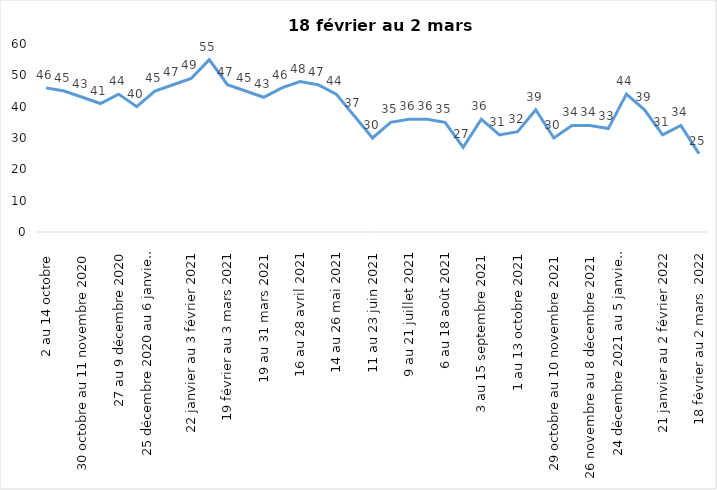
| Category | Toujours aux trois mesures |
|---|---|
| 2 au 14 octobre  | 46 |
| 16 au 28 octobre 2020 | 45 |
| 30 octobre au 11 novembre 2020 | 43 |
| 13 au 25 novembre 2020 | 41 |
| 27 au 9 décembre 2020 | 44 |
| 11 au 25 décembre 2020 | 40 |
| 25 décembre 2020 au 6 janvier 2021 | 45 |
| 8 au 20 janvier 2021 | 47 |
| 22 janvier au 3 février 2021 | 49 |
| 5 au 17 février 2021 | 55 |
| 19 février au 3 mars 2021 | 47 |
| 5 au 17 mars 2021 | 45 |
| 19 au 31 mars 2021 | 43 |
| 2 au 14 avril 2021 | 46 |
| 16 au 28 avril 2021 | 48 |
| 30 avril au 12 mai 2021 | 47 |
| 14 au 26 mai 2021 | 44 |
| 28 mai au 9 juin 2021 | 37 |
| 11 au 23 juin 2021 | 30 |
| 25 juin au 7 juillet 2021 | 35 |
| 9 au 21 juillet 2021 | 36 |
| 23 au 4 août 2021 | 36 |
| 6 au 18 août 2021 | 35 |
| 20 août au 1er septembre 2021 | 27 |
| 3 au 15 septembre 2021 | 36 |
| 17 au 29 septembre 2021 | 31 |
| 1 au 13 octobre 2021 | 32 |
| 15 au 27 octobre 2021 | 39 |
| 29 octobre au 10 novembre 2021 | 30 |
| 12 au 24 novembre 2021 | 34 |
| 26 novembre au 8 décembre 2021 | 34 |
| 10 au 22 décembre 2021 | 33 |
| 24 décembre 2021 au 5 janvier 2022 2022 | 44 |
| 7 au 19 janvier 2022 | 39 |
| 21 janvier au 2 février 2022 | 31 |
| 4 au 16 février 2022 | 34 |
| 18 février au 2 mars  2022 | 25 |